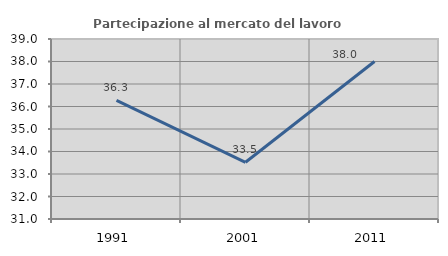
| Category | Partecipazione al mercato del lavoro  femminile |
|---|---|
| 1991.0 | 36.275 |
| 2001.0 | 33.521 |
| 2011.0 | 37.998 |